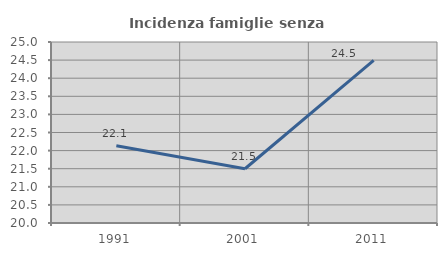
| Category | Incidenza famiglie senza nuclei |
|---|---|
| 1991.0 | 22.134 |
| 2001.0 | 21.499 |
| 2011.0 | 24.49 |